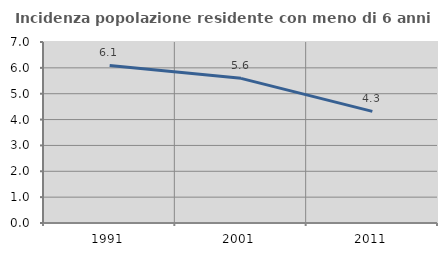
| Category | Incidenza popolazione residente con meno di 6 anni |
|---|---|
| 1991.0 | 6.093 |
| 2001.0 | 5.594 |
| 2011.0 | 4.318 |